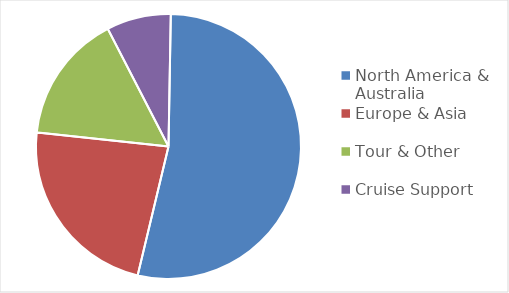
| Category | Series 0 |
|---|---|
| North America & Australia | 0.68 |
| Europe & Asia | 0.292 |
| Tour & Other | 0.2 |
| Cruise Support | 0.1 |